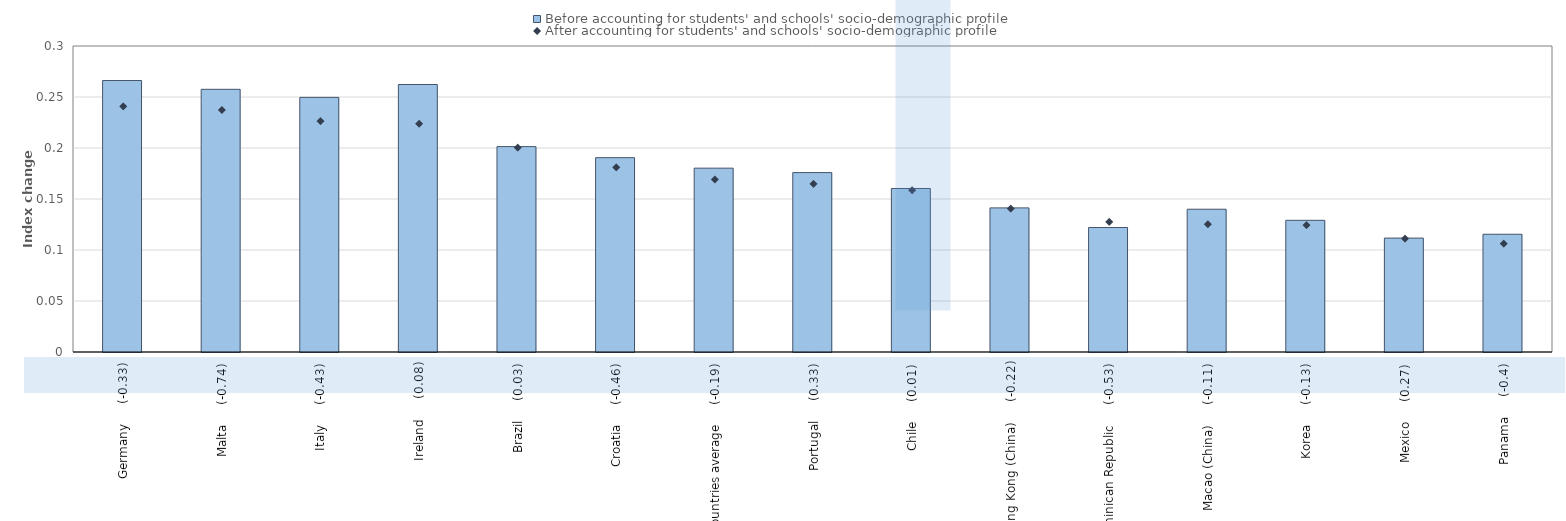
| Category | Before accounting for students' and schools' socio-demographic profile |
|---|---|
| Germany     (-0.33) | 0.266 |
| Malta     (-0.74) | 0.258 |
| Italy     (-0.43) | 0.25 |
| Ireland     (0.08) | 0.262 |
| Brazil     (0.03) | 0.201 |
| Croatia     (-0.46) | 0.191 |
| All countries average     (-0.19) | 0.18 |
| Portugal     (0.33) | 0.176 |
| Chile     (0.01) | 0.16 |
| Hong Kong (China)     (-0.22) | 0.141 |
| Dominican Republic     (-0.53) | 0.122 |
| Macao (China)     (-0.11) | 0.14 |
| Korea     (-0.13) | 0.129 |
| Mexico     (0.27) | 0.112 |
| Panama     (-0.4) | 0.115 |